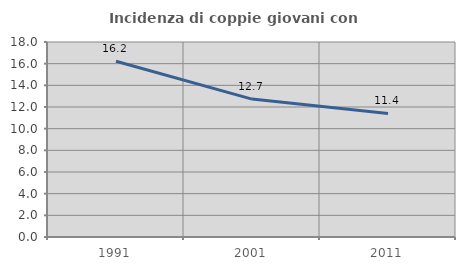
| Category | Incidenza di coppie giovani con figli |
|---|---|
| 1991.0 | 16.222 |
| 2001.0 | 12.729 |
| 2011.0 | 11.408 |